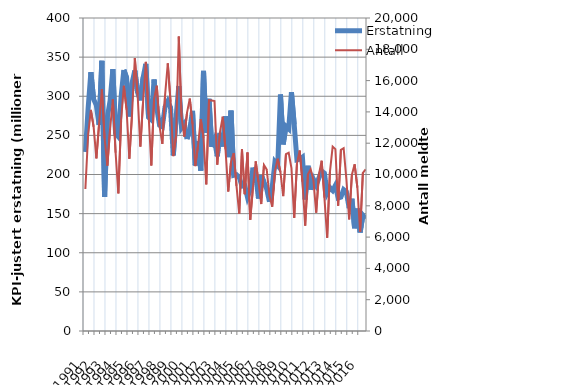
| Category | Erstatning |
|---|---|
| 1991.0 | 228.749 |
| nan | 284.604 |
| nan | 330.774 |
| nan | 296.254 |
| 1992.0 | 288.387 |
| nan | 263.506 |
| nan | 345.323 |
| nan | 171.267 |
| 1993.0 | 273.217 |
| nan | 294.381 |
| nan | 334.687 |
| nan | 252.715 |
| 1994.0 | 248.414 |
| nan | 299.114 |
| nan | 333.638 |
| nan | 323.684 |
| 1995.0 | 274.062 |
| nan | 317.038 |
| nan | 332.935 |
| nan | 304.87 |
| 1996.0 | 294.738 |
| nan | 323.554 |
| nan | 341.375 |
| nan | 272.922 |
| 1997.0 | 269.83 |
| nan | 321.383 |
| nan | 284.465 |
| nan | 262.977 |
| 1998.0 | 261.016 |
| nan | 286.331 |
| nan | 293.608 |
| nan | 285.708 |
| 1999.0 | 224.452 |
| nan | 272.35 |
| nan | 313.004 |
| nan | 259.609 |
| 2000.0 | 264.631 |
| nan | 245.415 |
| nan | 257.428 |
| nan | 281.433 |
| 2001.0 | 211.635 |
| nan | 242.737 |
| nan | 204.98 |
| nan | 332.459 |
| 2002.0 | 253.124 |
| nan | 296.757 |
| nan | 235.339 |
| nan | 244.335 |
| 2003.0 | 223.241 |
| nan | 252.96 |
| nan | 235.873 |
| nan | 274.261 |
| 2004.0 | 222.116 |
| nan | 281.572 |
| nan | 198.937 |
| nan | 199.767 |
| 2005.0 | 196.359 |
| nan | 185.065 |
| nan | 185.833 |
| nan | 171.134 |
| 2006.0 | 180.565 |
| nan | 208.811 |
| nan | 199.152 |
| nan | 169.287 |
| 2007.0 | 199.17 |
| nan | 190.26 |
| nan | 181.455 |
| nan | 165.26 |
| 2008.0 | 183.609 |
| nan | 215.888 |
| nan | 211.574 |
| nan | 302.246 |
| 2009.0 | 238.443 |
| nan | 261.694 |
| nan | 258.418 |
| nan | 305.219 |
| 2010.0 | 264.067 |
| nan | 218.648 |
| nan | 219.545 |
| nan | 222.163 |
| 2011.0 | 168.039 |
| nan | 211.087 |
| nan | 180.746 |
| nan | 194.01 |
| 2012.0 | 186.546 |
| nan | 195.537 |
| nan | 204.354 |
| nan | 201.669 |
| 2013.0 | 176.429 |
| nan | 183.382 |
| nan | 179.613 |
| nan | 186.09 |
| 2014.0 | 170.028 |
| nan | 171.115 |
| nan | 180.65 |
| nan | 177.838 |
| 2015.0 | 156.941 |
| nan | 169.095 |
| nan | 131.257 |
| nan | 156.432 |
| 2016.0 | 125.98 |
| nan | 147.855 |
| nan | 143.506 |